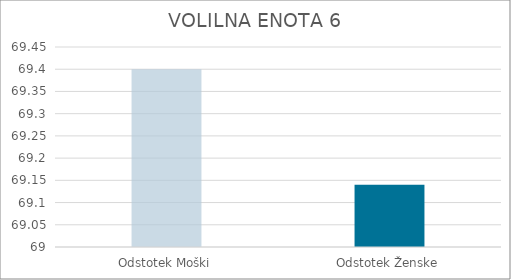
| Category | Series 0 |
|---|---|
| Odstotek Moški | 69.4 |
| Odstotek Ženske | 69.14 |